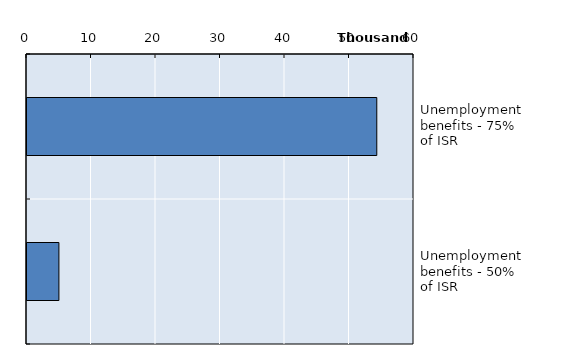
| Category | Series 0 |
|---|---|
| Unemployment benefits - 75% of ISR | 54230 |
| Unemployment benefits - 50% of ISR | 4949 |